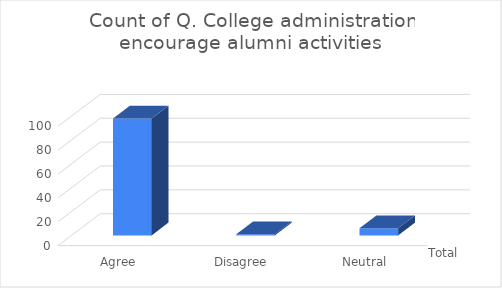
| Category | Total |
|---|---|
| Agree | 98 |
| Disagree | 1 |
| Neutral | 6 |